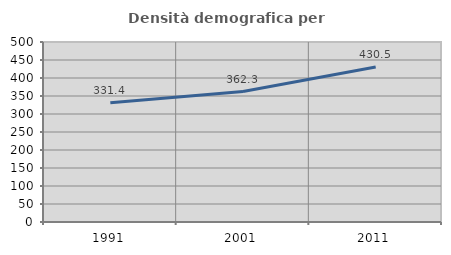
| Category | Densità demografica |
|---|---|
| 1991.0 | 331.353 |
| 2001.0 | 362.287 |
| 2011.0 | 430.535 |